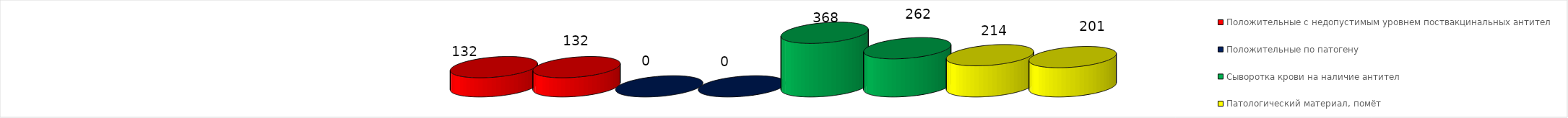
| Category | Положительные с недопустимым уровнем поствакцинальных антител | Положительные по патогену | Сыворотка крови на наличие антител | Патологический материал, помёт |
|---|---|---|---|---|
| Сыворотка крови на наличие антител | 132 | 0 | 262 | 201 |